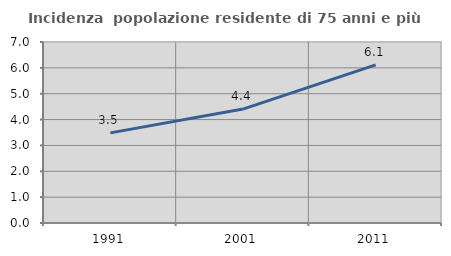
| Category | Incidenza  popolazione residente di 75 anni e più |
|---|---|
| 1991.0 | 3.486 |
| 2001.0 | 4.406 |
| 2011.0 | 6.116 |